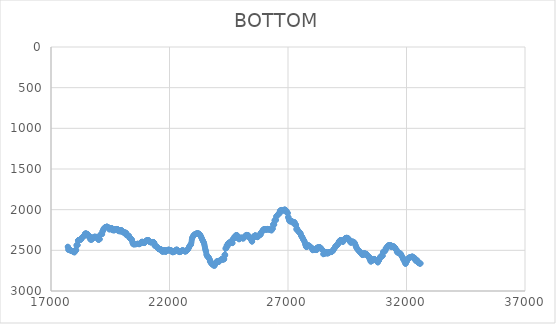
| Category | BOTTOM |
|---|---|
| 17706.1227 | 2455.2 |
| 17716.3628 | 2458.01 |
| 17726.6029 | 2493.2 |
| 17736.8429 | 2473.5 |
| 17747.083 | 2494.61 |
| 17757.323 | 2480.54 |
| 17767.5631 | 2483.35 |
| 17777.8031 | 2486.17 |
| 17788.0432 | 2490.39 |
| 17798.2833 | 2500.24 |
| 17808.5233 | 2497.43 |
| 17818.7634 | 2496.02 |
| 17829.0034 | 2500.24 |
| 17839.2435 | 2503.06 |
| 17849.4835 | 2505.87 |
| 17859.7236 | 2505.87 |
| 17869.9636 | 2507.28 |
| 17880.2037 | 2507.28 |
| 17890.4438 | 2508.69 |
| 17900.6838 | 2511.5 |
| 17910.9239 | 2508.69 |
| 17921.1639 | 2512.91 |
| 17931.404 | 2512.91 |
| 17941.644 | 2512.91 |
| 17951.8841 | 2515.73 |
| 17962.1242 | 2517.13 |
| 17972.3642 | 2519.95 |
| 17982.6043 | 2524.17 |
| 17992.8443 | 2525.58 |
| 18003.0844 | 2503.06 |
| 18013.3244 | 2501.65 |
| 18023.5645 | 2500.24 |
| 18033.8046 | 2498.84 |
| 18044.0446 | 2503.06 |
| 18054.2847 | 2498.84 |
| 18064.5247 | 2494.61 |
| 18074.7648 | 2439.72 |
| 18085.0048 | 2436.9 |
| 18095.2449 | 2434.08 |
| 18105.4849 | 2434.08 |
| 18115.725 | 2435.49 |
| 18125.9651 | 2435.49 |
| 18136.2051 | 2382 |
| 18146.4452 | 2377.78 |
| 18156.6852 | 2374.97 |
| 18166.9253 | 2373.56 |
| 18177.1653 | 2376.37 |
| 18187.4054 | 2372.15 |
| 18197.6455 | 2372.15 |
| 18207.8855 | 2370.74 |
| 18218.1256 | 2370.74 |
| 18228.3656 | 2369.33 |
| 18238.6057 | 2370.74 |
| 18248.8457 | 2366.52 |
| 18259.0858 | 2366.52 |
| 18269.3259 | 2363.7 |
| 18279.5659 | 2363.7 |
| 18289.806 | 2348.22 |
| 18300.046 | 2345.41 |
| 18310.2861 | 2341.18 |
| 18320.5261 | 2341.18 |
| 18330.7662 | 2339.77 |
| 18341.0063 | 2336.96 |
| 18351.2463 | 2332.74 |
| 18361.4864 | 2328.51 |
| 18371.7264 | 2324.29 |
| 18381.9665 | 2322.88 |
| 18392.2065 | 2318.66 |
| 18402.4466 | 2317.25 |
| 18412.6866 | 2318.66 |
| 18422.9267 | 2314.44 |
| 18433.1668 | 2296.14 |
| 18443.4068 | 2294.73 |
| 18453.6469 | 2294.73 |
| 18463.8869 | 2294.73 |
| 18474.127 | 2293.32 |
| 18484.367 | 2291.92 |
| 18494.6071 | 2296.14 |
| 18504.8472 | 2298.95 |
| 18515.0872 | 2300.36 |
| 18525.3273 | 2300.36 |
| 18535.5673 | 2298.95 |
| 18545.8074 | 2303.18 |
| 18556.0474 | 2305.99 |
| 18566.2875 | 2308.81 |
| 18576.5276 | 2311.62 |
| 18586.7676 | 2332.74 |
| 18597.0077 | 2328.51 |
| 18607.2477 | 2332.74 |
| 18617.4878 | 2331.33 |
| 18627.7278 | 2327.11 |
| 18637.9679 | 2329.92 |
| 18648.208 | 2334.14 |
| 18658.448 | 2367.93 |
| 18668.6881 | 2363.7 |
| 18678.9281 | 2365.11 |
| 18689.1682 | 2366.52 |
| 18699.4082 | 2370.74 |
| 18709.6483 | 2367.93 |
| 18719.8884 | 2363.7 |
| 18730.1284 | 2360.89 |
| 18740.3685 | 2356.67 |
| 18750.6085 | 2352.44 |
| 18760.8486 | 2355.26 |
| 18771.0886 | 2351.04 |
| 18781.3287 | 2346.81 |
| 18791.5687 | 2342.59 |
| 18801.8088 | 2338.37 |
| 18812.0489 | 2338.37 |
| 18822.2889 | 2336.96 |
| 18832.529 | 2332.74 |
| 18842.769 | 2332.74 |
| 18853.0091 | 2334.14 |
| 18863.2491 | 2334.14 |
| 18873.4892 | 2334.14 |
| 18883.7293 | 2338.37 |
| 18893.9693 | 2336.96 |
| 18904.2094 | 2338.37 |
| 18914.4494 | 2341.18 |
| 18924.6895 | 2336.96 |
| 18934.9295 | 2334.14 |
| 18945.1696 | 2334.14 |
| 18955.4097 | 2338.37 |
| 18965.6497 | 2338.37 |
| 18975.8898 | 2341.18 |
| 18986.1298 | 2365.11 |
| 18996.3699 | 2369.33 |
| 19006.6099 | 2367.93 |
| 19016.85 | 2367.93 |
| 19027.0901 | 2367.93 |
| 19037.3301 | 2363.7 |
| 19047.5702 | 2363.7 |
| 19057.8102 | 2362.3 |
| 19068.0503 | 2315.85 |
| 19078.2903 | 2311.62 |
| 19088.5304 | 2310.21 |
| 19098.7705 | 2305.99 |
| 19109.0105 | 2305.99 |
| 19119.2506 | 2297.55 |
| 19129.4906 | 2297.55 |
| 19139.7307 | 2297.55 |
| 19149.9707 | 2300.36 |
| 19160.2108 | 2300.36 |
| 19170.4508 | 2265.17 |
| 19180.6909 | 2263.76 |
| 19190.931 | 2259.54 |
| 19201.171 | 2258.13 |
| 19211.4111 | 2237.02 |
| 19221.6511 | 2237.02 |
| 19231.8912 | 2232.8 |
| 19242.1312 | 2228.57 |
| 19252.3713 | 2224.35 |
| 19262.6114 | 2222.94 |
| 19272.8514 | 2220.13 |
| 19283.0915 | 2215.9 |
| 19293.3315 | 2214.5 |
| 19303.5716 | 2215.9 |
| 19313.8116 | 2215.9 |
| 19324.0517 | 2211.68 |
| 19334.2918 | 2211.68 |
| 19344.5318 | 2211.68 |
| 19354.7719 | 2208.87 |
| 19365.0119 | 2208.87 |
| 19375.252 | 2210.27 |
| 19385.492 | 2213.09 |
| 19395.7321 | 2220.13 |
| 19405.9722 | 2217.31 |
| 19416.2122 | 2220.13 |
| 19426.4523 | 2217.31 |
| 19436.6923 | 2229.98 |
| 19446.9324 | 2222.94 |
| 19457.1724 | 2244.06 |
| 19467.4125 | 2229.98 |
| 19477.6526 | 2229.98 |
| 19487.8926 | 2234.2 |
| 19498.1327 | 2237.02 |
| 19508.3727 | 2234.2 |
| 19518.6128 | 2234.2 |
| 19528.8528 | 2227.17 |
| 19539.0929 | 2225.76 |
| 19549.3329 | 2225.76 |
| 19559.573 | 2225.76 |
| 19569.8131 | 2231.39 |
| 19580.0531 | 2251.09 |
| 19590.2932 | 2249.69 |
| 19600.5332 | 2249.69 |
| 19610.7733 | 2237.02 |
| 19621.0133 | 2237.02 |
| 19631.2534 | 2238.43 |
| 19641.4935 | 2256.73 |
| 19651.7335 | 2239.83 |
| 19661.9736 | 2241.24 |
| 19672.2136 | 2244.06 |
| 19682.4537 | 2252.5 |
| 19692.6937 | 2246.87 |
| 19702.9338 | 2242.65 |
| 19713.1739 | 2241.24 |
| 19723.4139 | 2239.83 |
| 19733.654 | 2239.83 |
| 19743.894 | 2238.43 |
| 19754.1341 | 2238.43 |
| 19764.3741 | 2238.43 |
| 19774.6142 | 2237.02 |
| 19784.8543 | 2238.43 |
| 19795.0943 | 2239.83 |
| 19805.3344 | 2242.65 |
| 19815.5744 | 2241.24 |
| 19825.8145 | 2248.28 |
| 19836.0545 | 2260.95 |
| 19846.2946 | 2251.09 |
| 19856.5347 | 2259.54 |
| 19866.7747 | 2259.54 |
| 19877.0148 | 2266.58 |
| 19887.2548 | 2255.32 |
| 19897.4949 | 2265.17 |
| 19907.7349 | 2252.5 |
| 19917.975 | 2256.73 |
| 19928.2151 | 2260.95 |
| 19938.4551 | 2262.36 |
| 19948.6952 | 2251.09 |
| 19958.9352 | 2251.09 |
| 19969.1753 | 2272.21 |
| 19979.4153 | 2253.91 |
| 19989.6554 | 2259.54 |
| 19999.8954 | 2260.95 |
| 20010.1355 | 2260.95 |
| 20020.3756 | 2265.17 |
| 20030.6156 | 2269.39 |
| 20040.8557 | 2273.62 |
| 20051.0957 | 2275.02 |
| 20061.3358 | 2277.84 |
| 20071.5758 | 2282.06 |
| 20081.8159 | 2287.69 |
| 20092.056 | 2283.47 |
| 20102.296 | 2283.47 |
| 20112.5361 | 2280.65 |
| 20122.7761 | 2282.06 |
| 20133.0162 | 2282.06 |
| 20143.2562 | 2283.47 |
| 20153.4963 | 2283.47 |
| 20163.7364 | 2284.88 |
| 20173.9764 | 2287.69 |
| 20184.2165 | 2314.44 |
| 20194.4565 | 2311.62 |
| 20204.6966 | 2311.62 |
| 20214.9366 | 2311.62 |
| 20225.1767 | 2314.44 |
| 20235.4168 | 2315.85 |
| 20245.6568 | 2313.03 |
| 20255.8969 | 2318.66 |
| 20266.1369 | 2320.07 |
| 20276.377 | 2321.48 |
| 20286.617 | 2321.48 |
| 20296.8571 | 2325.7 |
| 20307.0972 | 2345.41 |
| 20317.3372 | 2345.41 |
| 20327.5773 | 2346.81 |
| 20337.8173 | 2351.04 |
| 20348.0574 | 2351.04 |
| 20358.2974 | 2353.85 |
| 20368.5375 | 2358.07 |
| 20378.7776 | 2358.07 |
| 20389.0176 | 2362.3 |
| 20399.2577 | 2366.52 |
| 20409.4977 | 2370.74 |
| 20419.7378 | 2373.56 |
| 20429.9778 | 2391.57 |
| 20440.2179 | 2405.01 |
| 20450.458 | 2414.51 |
| 20460.698 | 2420.71 |
| 20470.9381 | 2424.23 |
| 20481.1781 | 2425.71 |
| 20491.4182 | 2425.79 |
| 20501.6582 | 2425.08 |
| 20511.8983 | 2424.23 |
| 20522.1383 | 2423.74 |
| 20532.3784 | 2423.62 |
| 20542.6185 | 2423.74 |
| 20552.8585 | 2423.99 |
| 20563.0986 | 2424.23 |
| 20573.3386 | 2424.35 |
| 20583.5787 | 2424.23 |
| 20593.8187 | 2423.79 |
| 20604.0588 | 2423.09 |
| 20614.2989 | 2422.25 |
| 20624.5389 | 2421.4 |
| 20634.779 | 2420.63 |
| 20645.019 | 2420.07 |
| 20655.2591 | 2419.82 |
| 20665.4991 | 2420.01 |
| 20675.7392 | 2420.68 |
| 20685.9793 | 2421.67 |
| 20696.2193 | 2422.72 |
| 20706.4594 | 2423.6 |
| 20716.6994 | 2424.07 |
| 20726.9395 | 2423.89 |
| 20737.1795 | 2422.82 |
| 20747.4196 | 2420.72 |
| 20757.6597 | 2417.77 |
| 20767.8997 | 2414.26 |
| 20778.1398 | 2410.46 |
| 20788.3798 | 2406.65 |
| 20798.6199 | 2403.12 |
| 20808.8599 | 2400.1 |
| 20819.1 | 2397.71 |
| 20829.3401 | 2396.02 |
| 20839.5801 | 2395.08 |
| 20849.8202 | 2394.96 |
| 20860.0602 | 2395.74 |
| 20870.3003 | 2397.49 |
| 20880.5403 | 2400.16 |
| 20890.7804 | 2403.33 |
| 20901.0205 | 2406.45 |
| 20911.2605 | 2408.99 |
| 20921.5006 | 2410.4 |
| 20931.7406 | 2410.16 |
| 20941.9807 | 2407.94 |
| 20952.2207 | 2404.37 |
| 20962.4608 | 2400.3 |
| 20972.7009 | 2396.43 |
| 20982.9409 | 2392.87 |
| 20993.181 | 2389.62 |
| 21003.421 | 2386.64 |
| 21013.6611 | 2383.93 |
| 21023.9011 | 2381.45 |
| 21034.1412 | 2379.19 |
| 21044.3813 | 2377.14 |
| 21054.6213 | 2375.41 |
| 21064.8614 | 2374.1 |
| 21075.1014 | 2373.32 |
| 21085.3415 | 2373.18 |
| 21095.5815 | 2373.81 |
| 21105.8216 | 2375.3 |
| 21116.0617 | 2377.78 |
| 21126.3017 | 2381.25 |
| 21136.5418 | 2385.32 |
| 21146.7818 | 2389.49 |
| 21157.0219 | 2393.26 |
| 21167.2619 | 2396.24 |
| 21177.502 | 2398.41 |
| 21187.742 | 2399.88 |
| 21197.9821 | 2400.75 |
| 21208.2222 | 2401.11 |
| 21218.4622 | 2401.05 |
| 21228.7023 | 2400.68 |
| 21238.9423 | 2400.1 |
| 21249.1824 | 2399.4 |
| 21259.4224 | 2398.67 |
| 21269.6625 | 2398.02 |
| 21279.9026 | 2397.54 |
| 21290.1426 | 2397.33 |
| 21300.3827 | 2397.49 |
| 21310.6227 | 2398.11 |
| 21320.8628 | 2399.29 |
| 21331.1028 | 2401.13 |
| 21341.3429 | 2403.72 |
| 21351.583 | 2407.17 |
| 21361.823 | 2411.56 |
| 21372.0631 | 2442.53 |
| 21382.3031 | 2442.53 |
| 21392.5432 | 2442.53 |
| 21402.7832 | 2442.53 |
| 21413.0233 | 2448.16 |
| 21423.2634 | 2446.75 |
| 21433.5034 | 2449.57 |
| 21443.7435 | 2449.57 |
| 21453.9835 | 2453.79 |
| 21464.2236 | 2456.61 |
| 21474.4636 | 2459.42 |
| 21484.7037 | 2462.24 |
| 21494.9438 | 2463.64 |
| 21505.1838 | 2473.5 |
| 21515.4239 | 2477.72 |
| 21525.6639 | 2479.13 |
| 21535.904 | 2479.13 |
| 21546.144 | 2483.35 |
| 21556.3841 | 2484.76 |
| 21566.6242 | 2486.17 |
| 21576.8642 | 2488.98 |
| 21587.1043 | 2486.17 |
| 21597.3443 | 2486.17 |
| 21607.5844 | 2484.76 |
| 21617.8244 | 2484.76 |
| 21628.0645 | 2486.17 |
| 21638.3046 | 2490.39 |
| 21648.5446 | 2490.39 |
| 21658.7847 | 2491.8 |
| 21669.0247 | 2498.84 |
| 21679.2648 | 2512.91 |
| 21689.5048 | 2514.32 |
| 21699.7449 | 2514.32 |
| 21709.985 | 2511.5 |
| 21720.225 | 2512.91 |
| 21730.4651 | 2514.32 |
| 21740.7051 | 2514.32 |
| 21750.9452 | 2500.24 |
| 21761.1852 | 2500.24 |
| 21771.4253 | 2498.84 |
| 21781.6654 | 2497.43 |
| 21791.9054 | 2497.43 |
| 21802.1455 | 2498.84 |
| 21812.3855 | 2500.24 |
| 21822.6256 | 2518.54 |
| 21832.8656 | 2515.73 |
| 21843.1057 | 2512.91 |
| 21853.3458 | 2512.91 |
| 21863.5858 | 2511.5 |
| 21873.8259 | 2510.1 |
| 21884.0659 | 2508.69 |
| 21894.306 | 2507.28 |
| 21904.546 | 2505.87 |
| 21914.7861 | 2497.43 |
| 21925.0262 | 2494.61 |
| 21935.2662 | 2494.61 |
| 21945.5063 | 2494.61 |
| 21955.7463 | 2493.2 |
| 21965.9864 | 2491.8 |
| 21976.2264 | 2491.8 |
| 21986.4665 | 2498.84 |
| 21996.7066 | 2498.84 |
| 22006.9466 | 2501.65 |
| 22017.1867 | 2498.84 |
| 22027.4267 | 2498.84 |
| 22037.6668 | 2500.24 |
| 22047.9068 | 2501.65 |
| 22058.1469 | 2501.65 |
| 22068.387 | 2501.65 |
| 22078.627 | 2503.06 |
| 22088.8671 | 2505.87 |
| 22099.1071 | 2505.87 |
| 22109.3472 | 2521.36 |
| 22119.5872 | 2521.36 |
| 22129.8273 | 2521.36 |
| 22140.0674 | 2524.17 |
| 22150.3074 | 2521.36 |
| 22160.5475 | 2521.36 |
| 22170.7875 | 2518.54 |
| 22181.0276 | 2515.73 |
| 22191.2676 | 2515.73 |
| 22201.5077 | 2519.95 |
| 22211.7478 | 2505.87 |
| 22221.9878 | 2505.87 |
| 22232.2279 | 2507.28 |
| 22242.4679 | 2505.87 |
| 22252.708 | 2505.87 |
| 22262.948 | 2499.89 |
| 22273.1881 | 2495.67 |
| 22283.4281 | 2493.03 |
| 22293.6682 | 2491.79 |
| 22303.9083 | 2491.78 |
| 22314.1483 | 2492.81 |
| 22324.3884 | 2494.7 |
| 22334.6284 | 2497.27 |
| 22344.8685 | 2500.35 |
| 22355.1085 | 2503.74 |
| 22365.3486 | 2507.28 |
| 22375.5887 | 2510.78 |
| 22385.8287 | 2514.05 |
| 22396.0688 | 2516.93 |
| 22406.3088 | 2519.23 |
| 22416.5489 | 2520.76 |
| 22426.7889 | 2521.36 |
| 22437.029 | 2520.9 |
| 22447.2691 | 2519.54 |
| 22457.5091 | 2517.52 |
| 22467.7492 | 2515.06 |
| 22477.9892 | 2512.38 |
| 22488.2293 | 2509.71 |
| 22498.4693 | 2507.28 |
| 22508.7094 | 2505.28 |
| 22518.9495 | 2503.72 |
| 22529.1895 | 2502.6 |
| 22539.4296 | 2501.9 |
| 22549.6696 | 2501.61 |
| 22559.9097 | 2501.72 |
| 22570.1497 | 2502.21 |
| 22580.3898 | 2503.06 |
| 22590.6299 | 2504.25 |
| 22600.8699 | 2505.67 |
| 22611.11 | 2507.22 |
| 22621.35 | 2508.79 |
| 22631.5901 | 2510.25 |
| 22641.8301 | 2511.5 |
| 22652.0702 | 2512.43 |
| 22662.3103 | 2512.91 |
| 22672.5503 | 2512.86 |
| 22682.7904 | 2512.29 |
| 22693.0304 | 2511.21 |
| 22703.2705 | 2509.66 |
| 22713.5105 | 2507.66 |
| 22723.7506 | 2505.22 |
| 22733.9907 | 2502.39 |
| 22744.2307 | 2499.19 |
| 22754.4708 | 2495.63 |
| 22764.7108 | 2491.75 |
| 22774.9509 | 2487.57 |
| 22785.1909 | 2483.09 |
| 22795.431 | 2478.18 |
| 22805.6711 | 2472.69 |
| 22815.9111 | 2466.46 |
| 22826.1512 | 2459.48 |
| 22836.3912 | 2452.32 |
| 22846.6313 | 2445.7 |
| 22856.8713 | 2440.32 |
| 22867.1114 | 2436.9 |
| 22877.3515 | 2435.68 |
| 22887.5915 | 2434.98 |
| 22897.8316 | 2432.63 |
| 22908.0716 | 2426.48 |
| 22918.3117 | 2414.38 |
| 22928.5517 | 2395.44 |
| 22938.7918 | 2373.89 |
| 22949.0319 | 2355.26 |
| 22959.2719 | 2347.4 |
| 22969.512 | 2340.38 |
| 22979.752 | 2334.14 |
| 22989.9921 | 2328.63 |
| 23000.2321 | 2323.77 |
| 23010.4722 | 2319.52 |
| 23020.7123 | 2315.8 |
| 23030.9523 | 2312.56 |
| 23041.1924 | 2309.74 |
| 23051.4324 | 2307.28 |
| 23061.6725 | 2305.11 |
| 23071.9125 | 2303.18 |
| 23082.1526 | 2301.43 |
| 23092.3927 | 2299.84 |
| 23102.6327 | 2298.41 |
| 23112.8728 | 2297.13 |
| 23123.1128 | 2295.99 |
| 23133.3529 | 2294.98 |
| 23143.5929 | 2294.1 |
| 23153.833 | 2293.32 |
| 23164.0731 | 2292.67 |
| 23174.3131 | 2292.17 |
| 23184.5532 | 2291.9 |
| 23194.7932 | 2291.92 |
| 23205.0333 | 2292.26 |
| 23215.2733 | 2292.97 |
| 23225.5134 | 2294.07 |
| 23235.7535 | 2295.58 |
| 23245.9935 | 2297.54 |
| 23256.2336 | 2299.95 |
| 23266.4736 | 2302.85 |
| 23276.7137 | 2306.26 |
| 23286.9537 | 2310.21 |
| 23297.1938 | 2314.72 |
| 23307.4339 | 2319.76 |
| 23317.6739 | 2325.3 |
| 23327.914 | 2331.33 |
| 23338.154 | 2337.79 |
| 23348.3941 | 2344.55 |
| 23358.6341 | 2351.47 |
| 23368.8742 | 2358.37 |
| 23379.1143 | 2365.11 |
| 23389.3543 | 2371.56 |
| 23399.5944 | 2377.7 |
| 23409.8344 | 2383.53 |
| 23420.0745 | 2389.04 |
| 23430.3145 | 2394.39 |
| 23440.5546 | 2400.29 |
| 23450.7947 | 2407.6 |
| 23461.0347 | 2417.19 |
| 23471.2748 | 2429.6 |
| 23481.5148 | 2444.05 |
| 23491.7549 | 2459.42 |
| 23501.9949 | 2474.62 |
| 23512.235 | 2488.53 |
| 23522.4751 | 2500.06 |
| 23532.7151 | 2508.08 |
| 23542.9552 | 2511.5 |
| 23553.1952 | 2539.66 |
| 23563.4353 | 2557.96 |
| 23573.6753 | 2560.77 |
| 23583.9154 | 2562.18 |
| 23594.1555 | 2574.85 |
| 23604.3955 | 2574.85 |
| 23614.6356 | 2576.25 |
| 23624.8756 | 2579.07 |
| 23635.1157 | 2580.48 |
| 23645.3557 | 2586.11 |
| 23655.5958 | 2587.52 |
| 23665.8359 | 2597.37 |
| 23676.0759 | 2600.18 |
| 23686.316 | 2607.22 |
| 23696.556 | 2612.85 |
| 23706.7961 | 2636.78 |
| 23717.0361 | 2631.15 |
| 23727.2762 | 2631.15 |
| 23737.5163 | 2650.86 |
| 23747.7563 | 2650.86 |
| 23757.9964 | 2655.08 |
| 23768.2364 | 2659.3 |
| 23778.4765 | 2664.93 |
| 23788.7165 | 2666.34 |
| 23798.9566 | 2667.75 |
| 23809.1967 | 2669.16 |
| 23819.4367 | 2670.56 |
| 23829.6768 | 2673.38 |
| 23839.9168 | 2681.83 |
| 23850.1569 | 2686.05 |
| 23860.397 | 2683.23 |
| 23870.637 | 2679.01 |
| 23880.8771 | 2683.23 |
| 23891.1171 | 2687.46 |
| 23901.3572 | 2690.27 |
| 23911.5972 | 2671.97 |
| 23921.8373 | 2667.75 |
| 23932.0774 | 2666.34 |
| 23942.3174 | 2663.53 |
| 23952.5575 | 2659.3 |
| 23962.7975 | 2655.08 |
| 23973.0376 | 2656.49 |
| 23983.2776 | 2639.6 |
| 23993.5177 | 2638.19 |
| 24003.7578 | 2633.97 |
| 24013.9978 | 2638.19 |
| 24024.2379 | 2636.78 |
| 24034.4779 | 2635.37 |
| 24044.718 | 2636.78 |
| 24054.958 | 2635.37 |
| 24065.1981 | 2639.6 |
| 24075.4382 | 2639.6 |
| 24085.6782 | 2642.41 |
| 24095.9183 | 2631.15 |
| 24106.1583 | 2632.56 |
| 24116.3984 | 2628.34 |
| 24126.6384 | 2624.11 |
| 24136.8785 | 2622.71 |
| 24147.1186 | 2618.48 |
| 24157.3586 | 2617.08 |
| 24167.5987 | 2618.48 |
| 24177.8387 | 2614.26 |
| 24188.0788 | 2610.04 |
| 24198.3188 | 2610.04 |
| 24208.5589 | 2610.04 |
| 24218.799 | 2605.81 |
| 24229.039 | 2610.04 |
| 24239.2791 | 2608.63 |
| 24249.5191 | 2611.44 |
| 24259.7592 | 2615.67 |
| 24269.9992 | 2608.63 |
| 24280.2393 | 2608.63 |
| 24290.4794 | 2610.04 |
| 24300.7194 | 2610.04 |
| 24310.9595 | 2605.81 |
| 24321.1995 | 2556.55 |
| 24331.4396 | 2553.73 |
| 24341.6796 | 2557.96 |
| 24351.9197 | 2557.96 |
| 24362.1598 | 2479.13 |
| 24372.3998 | 2474.91 |
| 24382.6399 | 2470.68 |
| 24392.8799 | 2472.09 |
| 24403.12 | 2467.87 |
| 24413.36 | 2439.72 |
| 24423.6001 | 2439.72 |
| 24433.8402 | 2439.72 |
| 24444.0802 | 2443.94 |
| 24454.3203 | 2448.16 |
| 24464.5603 | 2417.19 |
| 24474.8004 | 2415.79 |
| 24485.0404 | 2411.56 |
| 24495.2805 | 2412.97 |
| 24505.5206 | 2412.97 |
| 24515.7606 | 2408.75 |
| 24526.0007 | 2405.93 |
| 24536.2407 | 2405.93 |
| 24546.4808 | 2401.71 |
| 24556.7208 | 2398.89 |
| 24566.9609 | 2394.67 |
| 24577.201 | 2393.26 |
| 24587.441 | 2397.49 |
| 24597.6811 | 2397.49 |
| 24607.9211 | 2400.3 |
| 24618.1612 | 2404.53 |
| 24628.4012 | 2404.53 |
| 24638.6413 | 2408.75 |
| 24648.8814 | 2408.75 |
| 24659.1214 | 2411.56 |
| 24669.3615 | 2365.11 |
| 24679.6015 | 2360.89 |
| 24689.8416 | 2358.07 |
| 24700.0816 | 2360.89 |
| 24710.3217 | 2356.67 |
| 24720.5618 | 2353.85 |
| 24730.8018 | 2353.85 |
| 24741.0419 | 2332.74 |
| 24751.2819 | 2329.92 |
| 24761.522 | 2334.14 |
| 24771.762 | 2331.33 |
| 24782.0021 | 2334.14 |
| 24792.2422 | 2334.14 |
| 24802.4822 | 2314.44 |
| 24812.7223 | 2314.44 |
| 24822.9623 | 2313.03 |
| 24833.2024 | 2314.44 |
| 24843.4424 | 2315.85 |
| 24853.6825 | 2317.25 |
| 24863.9226 | 2318.66 |
| 24874.1626 | 2348.22 |
| 24884.4027 | 2348.22 |
| 24894.6427 | 2349.63 |
| 24904.8828 | 2348.22 |
| 24915.1228 | 2352.44 |
| 24925.3629 | 2355.26 |
| 24935.603 | 2365.11 |
| 24945.843 | 2360.89 |
| 24956.0831 | 2356.67 |
| 24966.3231 | 2355.26 |
| 24976.5632 | 2351.04 |
| 24986.8033 | 2348.22 |
| 24997.0433 | 2346.81 |
| 25007.2834 | 2345.41 |
| 25017.5234 | 2345.41 |
| 25027.7635 | 2345.41 |
| 25038.0035 | 2345.41 |
| 25048.2436 | 2345.41 |
| 25058.4837 | 2349.63 |
| 25068.7237 | 2351.04 |
| 25078.9638 | 2351.04 |
| 25089.2038 | 2352.44 |
| 25099.4439 | 2351.04 |
| 25109.6839 | 2351.04 |
| 25119.924 | 2355.26 |
| 25130.1641 | 2341.18 |
| 25140.4041 | 2341.18 |
| 25150.6442 | 2339.77 |
| 25160.8842 | 2336.96 |
| 25171.1243 | 2332.74 |
| 25181.3643 | 2332.74 |
| 25191.6044 | 2331.33 |
| 25201.8445 | 2318.66 |
| 25212.0845 | 2320.07 |
| 25222.3246 | 2317.25 |
| 25232.5646 | 2315.85 |
| 25242.8047 | 2313.03 |
| 25253.0447 | 2310.21 |
| 25263.2848 | 2315.85 |
| 25273.5249 | 2311.62 |
| 25283.7649 | 2311.62 |
| 25294.005 | 2315.85 |
| 25304.245 | 2313.03 |
| 25314.4851 | 2315.85 |
| 25324.7251 | 2317.25 |
| 25334.9652 | 2329.92 |
| 25345.2053 | 2334.14 |
| 25355.4453 | 2334.14 |
| 25365.6854 | 2336.96 |
| 25375.9254 | 2338.37 |
| 25386.1655 | 2342.59 |
| 25396.4055 | 2342.59 |
| 25406.6456 | 2346.81 |
| 25416.8857 | 2359.48 |
| 25427.1257 | 2362.3 |
| 25437.3658 | 2362.3 |
| 25447.6058 | 2366.52 |
| 25457.8459 | 2369.33 |
| 25468.0859 | 2389.04 |
| 25478.326 | 2391.86 |
| 25488.5661 | 2391.86 |
| 25498.8061 | 2352.44 |
| 25509.0462 | 2351.04 |
| 25519.2862 | 2346.81 |
| 25529.5263 | 2345.41 |
| 25539.7663 | 2349.63 |
| 25550.0064 | 2331.33 |
| 25560.2465 | 2327.11 |
| 25570.4865 | 2325.7 |
| 25580.7266 | 2324.29 |
| 25590.9666 | 2320.07 |
| 25601.2067 | 2320.07 |
| 25611.4467 | 2317.25 |
| 25621.6868 | 2317.25 |
| 25631.9269 | 2317.25 |
| 25642.1669 | 2321.48 |
| 25652.407 | 2324.29 |
| 25662.647 | 2332.74 |
| 25672.8871 | 2331.33 |
| 25683.1272 | 2327.11 |
| 25693.3672 | 2329.92 |
| 25703.6073 | 2334.14 |
| 25713.8473 | 2338.37 |
| 25724.0874 | 2336.96 |
| 25734.3274 | 2329.92 |
| 25744.5675 | 2325.7 |
| 25754.8076 | 2321.48 |
| 25765.0476 | 2317.25 |
| 25775.2877 | 2317.25 |
| 25785.5277 | 2313.03 |
| 25795.7678 | 2307.4 |
| 25806.0078 | 2307.4 |
| 25816.2479 | 2305.99 |
| 25826.488 | 2305.99 |
| 25836.728 | 2307.4 |
| 25846.9681 | 2308.81 |
| 25857.2081 | 2284.88 |
| 25867.4482 | 2280.65 |
| 25877.6882 | 2276.43 |
| 25887.9283 | 2275.02 |
| 25898.1684 | 2272.21 |
| 25908.4084 | 2267.99 |
| 25918.6485 | 2267.99 |
| 25928.8885 | 2256.73 |
| 25939.1286 | 2252.5 |
| 25949.3686 | 2249.69 |
| 25959.6087 | 2246.87 |
| 25969.8488 | 2244.06 |
| 25980.0888 | 2244.06 |
| 25990.3289 | 2239.83 |
| 26000.5689 | 2238.43 |
| 26010.809 | 2242.65 |
| 26021.049 | 2241.24 |
| 26031.2891 | 2237.02 |
| 26041.5292 | 2238.43 |
| 26051.7692 | 2238.43 |
| 26062.0093 | 2238.43 |
| 26072.2493 | 2242.65 |
| 26082.4894 | 2246.87 |
| 26092.7294 | 2248.28 |
| 26102.9695 | 2239.83 |
| 26113.2096 | 2242.65 |
| 26123.4496 | 2238.43 |
| 26133.6897 | 2237.02 |
| 26143.9297 | 2237.02 |
| 26154.1698 | 2238.43 |
| 26164.4099 | 2238.43 |
| 26174.6499 | 2241.24 |
| 26184.89 | 2241.24 |
| 26195.13 | 2241.24 |
| 26205.3701 | 2242.65 |
| 26215.6101 | 2244.06 |
| 26225.8502 | 2242.65 |
| 26236.0903 | 2246.87 |
| 26246.3303 | 2248.28 |
| 26256.5704 | 2246.87 |
| 26266.8104 | 2245.46 |
| 26277.0505 | 2248.28 |
| 26287.2905 | 2249.69 |
| 26297.5306 | 2253.91 |
| 26307.7707 | 2255.32 |
| 26318.0107 | 2244.06 |
| 26328.2508 | 2239.83 |
| 26338.4908 | 2237.02 |
| 26348.7309 | 2235.61 |
| 26358.9709 | 2231.39 |
| 26369.211 | 2184.94 |
| 26379.4511 | 2180.71 |
| 26389.6911 | 2180.71 |
| 26399.9312 | 2180.71 |
| 26410.1712 | 2182.12 |
| 26420.4113 | 2183.53 |
| 26430.6513 | 2134.26 |
| 26440.8914 | 2131.45 |
| 26451.1315 | 2127.22 |
| 26461.3715 | 2127.22 |
| 26471.6116 | 2127.22 |
| 26481.8516 | 2127.22 |
| 26492.0917 | 2128.63 |
| 26502.3317 | 2086.4 |
| 26512.5718 | 2082.18 |
| 26522.8119 | 2079.37 |
| 26533.0519 | 2075.14 |
| 26543.292 | 2070.92 |
| 26553.532 | 2069.51 |
| 26563.7721 | 2065.29 |
| 26574.0121 | 2061.07 |
| 26584.2522 | 2058.25 |
| 26594.4923 | 2054.03 |
| 26604.7323 | 2049.81 |
| 26614.9724 | 2046.99 |
| 26625.2124 | 2042.77 |
| 26635.4525 | 2044.18 |
| 26645.6926 | 2048.4 |
| 26655.9326 | 2017.43 |
| 26666.1727 | 2014.62 |
| 26676.4127 | 2013.21 |
| 26686.6528 | 2008.98 |
| 26696.8928 | 2008.98 |
| 26707.1329 | 2006.17 |
| 26717.373 | 2006.17 |
| 26727.613 | 2004.76 |
| 26737.8531 | 2003.35 |
| 26748.0931 | 2003.35 |
| 26758.3332 | 2006.17 |
| 26768.5732 | 2007.58 |
| 26778.8133 | 2010.39 |
| 26789.0534 | 2011.8 |
| 26799.2934 | 2007.58 |
| 26809.5335 | 2007.58 |
| 26819.7735 | 2004.76 |
| 26830.0136 | 2003.35 |
| 26840.2536 | 2000.54 |
| 26850.4937 | 2001.95 |
| 26860.7338 | 1999.13 |
| 26870.9738 | 2000.54 |
| 26881.2139 | 2001.95 |
| 26891.4539 | 2003.35 |
| 26901.694 | 2006.17 |
| 26911.934 | 2010.39 |
| 26922.1741 | 2011.8 |
| 26932.4142 | 2016.02 |
| 26942.6542 | 2018.84 |
| 26952.8943 | 2037.14 |
| 26963.1343 | 2037.14 |
| 26973.3744 | 2035.73 |
| 26983.6144 | 2039.95 |
| 26993.8545 | 2044.18 |
| 27004.0946 | 2092.03 |
| 27014.3346 | 2093.44 |
| 27024.5747 | 2096.26 |
| 27034.8147 | 2118.78 |
| 27045.0548 | 2120.19 |
| 27055.2949 | 2138.49 |
| 27065.5349 | 2139.89 |
| 27075.775 | 2139.89 |
| 27086.015 | 2141.3 |
| 27096.2551 | 2141.3 |
| 27106.4951 | 2146.93 |
| 27116.7352 | 2145.52 |
| 27126.9753 | 2141.3 |
| 27137.2153 | 2138.49 |
| 27147.4554 | 2138.49 |
| 27157.6954 | 2141.3 |
| 27167.9355 | 2145.52 |
| 27178.1755 | 2145.52 |
| 27188.4156 | 2148.34 |
| 27198.6557 | 2159.6 |
| 27208.8957 | 2158.19 |
| 27219.1358 | 2159.6 |
| 27229.3758 | 2156.78 |
| 27239.6159 | 2156.78 |
| 27249.8559 | 2156.78 |
| 27260.096 | 2155.38 |
| 27270.3361 | 2152.56 |
| 27280.5761 | 2156.78 |
| 27290.8162 | 2184.94 |
| 27301.0562 | 2183.53 |
| 27311.2963 | 2187.75 |
| 27321.5363 | 2184.94 |
| 27331.7764 | 2184.94 |
| 27342.0165 | 2189.16 |
| 27352.2565 | 2242.65 |
| 27362.4966 | 2238.43 |
| 27372.7366 | 2234.2 |
| 27382.9767 | 2231.39 |
| 27393.2168 | 2253.91 |
| 27403.4568 | 2252.5 |
| 27413.6969 | 2253.91 |
| 27423.9369 | 2253.91 |
| 27434.177 | 2256.73 |
| 27444.417 | 2270.8 |
| 27454.6571 | 2272.21 |
| 27464.8972 | 2273.62 |
| 27475.1372 | 2276.43 |
| 27485.3773 | 2279.25 |
| 27495.6173 | 2280.65 |
| 27505.8574 | 2287.69 |
| 27516.0974 | 2289.1 |
| 27526.3375 | 2289.1 |
| 27536.5776 | 2298.95 |
| 27546.8176 | 2314.44 |
| 27557.0577 | 2317.25 |
| 27567.2977 | 2327.11 |
| 27577.5378 | 2327.11 |
| 27587.7778 | 2334.14 |
| 27598.0179 | 2337.08 |
| 27608.258 | 2342.61 |
| 27618.498 | 2349.63 |
| 27628.7381 | 2357.03 |
| 27638.9781 | 2363.7 |
| 27649.2182 | 2368.88 |
| 27659.4582 | 2373.04 |
| 27669.6983 | 2377.01 |
| 27679.9384 | 2381.61 |
| 27690.1784 | 2387.63 |
| 27700.4185 | 2395.67 |
| 27710.6585 | 2405.27 |
| 27720.8986 | 2415.79 |
| 27731.1387 | 2426.53 |
| 27741.3787 | 2436.82 |
| 27751.6188 | 2445.99 |
| 27761.8588 | 2453.37 |
| 27772.0989 | 2458.28 |
| 27782.3389 | 2460.04 |
| 27792.579 | 2457.98 |
| 27802.8191 | 2451.43 |
| 27813.0591 | 2439.72 |
| 27823.2992 | 2439.72 |
| 27833.5392 | 2441.12 |
| 27843.7793 | 2442.53 |
| 27854.0193 | 2445.35 |
| 27864.2594 | 2439.72 |
| 27874.4995 | 2439.72 |
| 27884.7395 | 2442.53 |
| 27894.9796 | 2442.53 |
| 27905.2196 | 2448.16 |
| 27915.4597 | 2448.16 |
| 27925.6997 | 2452.38 |
| 27935.9398 | 2453.79 |
| 27946.1799 | 2455.2 |
| 27956.4199 | 2458.01 |
| 27966.66 | 2465.05 |
| 27976.9 | 2467.87 |
| 27987.1401 | 2472.09 |
| 27997.3802 | 2474.91 |
| 28007.6202 | 2470.68 |
| 28017.8603 | 2476.31 |
| 28028.1003 | 2479.13 |
| 28038.3404 | 2498.84 |
| 28048.5804 | 2494.61 |
| 28058.8205 | 2493.2 |
| 28069.0606 | 2490.39 |
| 28079.3006 | 2490.39 |
| 28089.5407 | 2488.98 |
| 28099.7807 | 2487.57 |
| 28110.0208 | 2488.98 |
| 28120.2608 | 2488.98 |
| 28130.5009 | 2490.39 |
| 28140.741 | 2490.39 |
| 28150.981 | 2491.8 |
| 28161.2211 | 2494.61 |
| 28171.4611 | 2494.61 |
| 28181.7012 | 2497.43 |
| 28191.9412 | 2474.91 |
| 28202.1813 | 2494.61 |
| 28212.4214 | 2496.02 |
| 28222.6614 | 2467.87 |
| 28232.9015 | 2467.87 |
| 28243.1415 | 2470.68 |
| 28253.3816 | 2466.46 |
| 28263.6216 | 2465.05 |
| 28273.8617 | 2465.05 |
| 28284.1018 | 2467.87 |
| 28294.3418 | 2463.64 |
| 28304.5819 | 2462.24 |
| 28314.8219 | 2462.24 |
| 28325.062 | 2463.64 |
| 28335.3021 | 2463.64 |
| 28345.5421 | 2463.64 |
| 28355.7822 | 2466.46 |
| 28366.0222 | 2466.46 |
| 28376.2623 | 2469.28 |
| 28386.5023 | 2479.13 |
| 28396.7424 | 2476.31 |
| 28406.9825 | 2480.54 |
| 28417.2225 | 2483.35 |
| 28427.4626 | 2488.98 |
| 28437.7026 | 2491.8 |
| 28447.9427 | 2493.2 |
| 28458.1827 | 2498.84 |
| 28468.4228 | 2501.65 |
| 28478.6629 | 2501.65 |
| 28488.9029 | 2548.1 |
| 28499.143 | 2542.47 |
| 28509.383 | 2542.47 |
| 28519.6231 | 2542.47 |
| 28529.8631 | 2536.84 |
| 28540.1032 | 2534.03 |
| 28550.3433 | 2542.47 |
| 28560.5833 | 2528.4 |
| 28570.8234 | 2526.99 |
| 28581.0634 | 2528.4 |
| 28591.3035 | 2522.76 |
| 28601.5436 | 2521.36 |
| 28611.7836 | 2521.36 |
| 28622.0237 | 2531.21 |
| 28632.2637 | 2538.25 |
| 28642.5038 | 2522.76 |
| 28652.7438 | 2535.43 |
| 28662.9839 | 2534.03 |
| 28673.224 | 2531.21 |
| 28683.464 | 2539.66 |
| 28693.7041 | 2529.8 |
| 28703.9441 | 2532.62 |
| 28714.1842 | 2531.21 |
| 28724.4242 | 2526.99 |
| 28734.6643 | 2524.17 |
| 28744.9044 | 2524.17 |
| 28755.1444 | 2522.76 |
| 28765.3845 | 2521.36 |
| 28775.6245 | 2521.36 |
| 28785.8646 | 2519.95 |
| 28796.1046 | 2518.54 |
| 28806.3447 | 2522.76 |
| 28816.5848 | 2517.13 |
| 28826.8248 | 2518.54 |
| 28837.0649 | 2519.95 |
| 28847.3049 | 2514.32 |
| 28857.545 | 2514.32 |
| 28867.7851 | 2511.5 |
| 28878.0251 | 2510.1 |
| 28888.2652 | 2510.1 |
| 28898.5052 | 2503.5 |
| 28908.7453 | 2497.43 |
| 28918.9853 | 2491.89 |
| 28929.2254 | 2486.87 |
| 28939.4655 | 2482.38 |
| 28949.7055 | 2478.42 |
| 28959.9456 | 2474.99 |
| 28970.1856 | 2472.09 |
| 28980.4257 | 2464.78 |
| 28990.6657 | 2457.82 |
| 29000.9058 | 2451.66 |
| 29011.1459 | 2446.75 |
| 29021.3859 | 2443.42 |
| 29031.626 | 2441.37 |
| 29041.866 | 2440.15 |
| 29052.1061 | 2439.34 |
| 29062.3461 | 2438.48 |
| 29072.5862 | 2437.15 |
| 29082.8263 | 2434.89 |
| 29093.0663 | 2431.27 |
| 29103.3064 | 2426.01 |
| 29113.5464 | 2419.5 |
| 29123.7865 | 2412.29 |
| 29134.0266 | 2404.91 |
| 29144.2666 | 2397.92 |
| 29154.5067 | 2391.86 |
| 29164.7467 | 2387.12 |
| 29174.9868 | 2383.49 |
| 29185.2268 | 2380.6 |
| 29195.4669 | 2378.13 |
| 29205.707 | 2376.15 |
| 29215.947 | 2374.78 |
| 29226.1871 | 2374.12 |
| 29236.4271 | 2374.33 |
| 29246.6672 | 2375.5 |
| 29256.9072 | 2377.78 |
| 29267.1473 | 2381.16 |
| 29277.3874 | 2385.14 |
| 29287.6274 | 2389.1 |
| 29297.8675 | 2392.43 |
| 29308.1075 | 2394.49 |
| 29318.3476 | 2394.67 |
| 29328.5877 | 2392.55 |
| 29338.8277 | 2388.52 |
| 29349.0678 | 2383.17 |
| 29359.3078 | 2377.09 |
| 29369.5479 | 2370.88 |
| 29379.7879 | 2365.11 |
| 29390.028 | 2360.27 |
| 29400.2681 | 2356.38 |
| 29410.5081 | 2353.31 |
| 29420.7482 | 2350.98 |
| 29430.9882 | 2349.26 |
| 29441.2283 | 2348.07 |
| 29451.4683 | 2347.29 |
| 29461.7084 | 2346.81 |
| 29471.9485 | 2346.57 |
| 29482.1885 | 2346.58 |
| 29492.4286 | 2346.91 |
| 29502.6686 | 2347.6 |
| 29512.9087 | 2348.72 |
| 29523.1487 | 2350.31 |
| 29533.3888 | 2352.44 |
| 29543.6289 | 2355.15 |
| 29553.8689 | 2358.45 |
| 29564.109 | 2362.31 |
| 29574.349 | 2366.75 |
| 29584.5891 | 2371.75 |
| 29594.8292 | 2377.31 |
| 29605.0692 | 2383.41 |
| 29615.3093 | 2389.92 |
| 29625.5493 | 2396.16 |
| 29635.7894 | 2401.3 |
| 29646.0294 | 2404.53 |
| 29656.2695 | 2405.28 |
| 29666.5096 | 2404.02 |
| 29676.7496 | 2401.47 |
| 29686.9897 | 2398.34 |
| 29697.2297 | 2395.37 |
| 29707.4698 | 2393.26 |
| 29717.7098 | 2392.56 |
| 29727.9499 | 2393.04 |
| 29738.19 | 2394.29 |
| 29748.43 | 2395.91 |
| 29758.6701 | 2397.49 |
| 29768.9101 | 2398.77 |
| 29779.1502 | 2400.07 |
| 29789.3903 | 2401.85 |
| 29799.6303 | 2404.59 |
| 29809.8704 | 2408.75 |
| 29820.1104 | 2414.63 |
| 29830.3505 | 2421.88 |
| 29840.5905 | 2429.99 |
| 29850.8306 | 2438.46 |
| 29861.0707 | 2446.75 |
| 29871.3107 | 2454.46 |
| 29881.5508 | 2461.51 |
| 29891.7908 | 2467.91 |
| 29902.0309 | 2473.67 |
| 29912.2709 | 2478.81 |
| 29922.511 | 2483.35 |
| 29932.7511 | 2487.3 |
| 29942.9911 | 2490.66 |
| 29953.2312 | 2493.46 |
| 29963.4712 | 2495.71 |
| 29973.7113 | 2497.43 |
| 29983.9513 | 2501.65 |
| 29994.1914 | 2501.65 |
| 30004.4315 | 2511.5 |
| 30014.6715 | 2512.91 |
| 30024.9116 | 2514.32 |
| 30035.1516 | 2518.54 |
| 30045.3917 | 2524.17 |
| 30055.6318 | 2526.99 |
| 30065.8718 | 2528.4 |
| 30076.1119 | 2532.62 |
| 30086.3519 | 2535.43 |
| 30096.592 | 2538.25 |
| 30106.832 | 2545.29 |
| 30117.0721 | 2546.69 |
| 30127.3122 | 2549.51 |
| 30137.5522 | 2557.96 |
| 30147.7923 | 2553.73 |
| 30158.0323 | 2553.73 |
| 30168.2724 | 2555.14 |
| 30178.5124 | 2556.55 |
| 30188.7525 | 2541.06 |
| 30198.9926 | 2541.06 |
| 30209.2326 | 2536.84 |
| 30219.4727 | 2535.43 |
| 30229.7127 | 2539.66 |
| 30239.9528 | 2538.25 |
| 30250.1929 | 2541.06 |
| 30260.4329 | 2549.51 |
| 30270.673 | 2549.51 |
| 30280.913 | 2546.69 |
| 30291.1531 | 2545.29 |
| 30301.3931 | 2541.06 |
| 30311.6332 | 2545.29 |
| 30321.8733 | 2549.51 |
| 30332.1133 | 2552.32 |
| 30342.3534 | 2566.4 |
| 30352.5934 | 2567.81 |
| 30362.8335 | 2566.4 |
| 30373.0735 | 2570.62 |
| 30383.3136 | 2572.03 |
| 30393.5537 | 2576.25 |
| 30403.7937 | 2577.66 |
| 30414.0338 | 2581.88 |
| 30424.2738 | 2580.48 |
| 30434.5139 | 2581.88 |
| 30444.754 | 2610.04 |
| 30454.994 | 2614.26 |
| 30465.2341 | 2615.67 |
| 30475.4741 | 2619.89 |
| 30485.7142 | 2636.78 |
| 30495.9542 | 2638.19 |
| 30506.1943 | 2633.97 |
| 30516.4344 | 2632.56 |
| 30526.6744 | 2632.56 |
| 30536.9145 | 2632.56 |
| 30547.1545 | 2628.34 |
| 30557.3946 | 2624.11 |
| 30567.6346 | 2614.26 |
| 30577.8747 | 2614.26 |
| 30588.1148 | 2612.85 |
| 30598.3548 | 2608.63 |
| 30608.5949 | 2607.22 |
| 30618.8349 | 2605.81 |
| 30629.075 | 2607.22 |
| 30639.3151 | 2605.81 |
| 30649.5551 | 2607.22 |
| 30659.7952 | 2615.67 |
| 30670.0352 | 2615.67 |
| 30680.2753 | 2615.67 |
| 30690.5153 | 2619.89 |
| 30700.7554 | 2619.89 |
| 30710.9955 | 2621.3 |
| 30721.2355 | 2621.3 |
| 30731.4756 | 2625.52 |
| 30741.7156 | 2629.74 |
| 30751.9557 | 2633.97 |
| 30762.1957 | 2638.19 |
| 30772.4358 | 2642.41 |
| 30782.6759 | 2646.63 |
| 30792.9159 | 2649.45 |
| 30803.156 | 2624.11 |
| 30813.396 | 2624.11 |
| 30823.6361 | 2628.34 |
| 30833.8762 | 2626.93 |
| 30844.1162 | 2622.71 |
| 30854.3563 | 2601.59 |
| 30864.5963 | 2597.37 |
| 30874.8364 | 2593.15 |
| 30885.0764 | 2593.15 |
| 30895.3165 | 2580.48 |
| 30905.5566 | 2576.25 |
| 30915.7966 | 2574.85 |
| 30926.0367 | 2573.44 |
| 30936.2767 | 2577.66 |
| 30946.5168 | 2579.07 |
| 30956.7568 | 2564.99 |
| 30966.9969 | 2569.22 |
| 30977.237 | 2572.03 |
| 30987.477 | 2570.62 |
| 30997.7171 | 2566.4 |
| 31007.9571 | 2519.95 |
| 31018.1972 | 2521.36 |
| 31028.4373 | 2521.36 |
| 31038.6773 | 2521.36 |
| 31048.9174 | 2517.13 |
| 31059.1574 | 2515.73 |
| 31069.3975 | 2505.87 |
| 31079.6375 | 2507.28 |
| 31089.8776 | 2507.28 |
| 31100.1177 | 2504.47 |
| 31110.3577 | 2503.06 |
| 31120.5978 | 2477.72 |
| 31130.8378 | 2473.5 |
| 31141.0779 | 2477.72 |
| 31151.3179 | 2473.5 |
| 31161.558 | 2469.28 |
| 31171.7981 | 2473.5 |
| 31182.0381 | 2458.01 |
| 31192.2782 | 2453.79 |
| 31202.5182 | 2452.38 |
| 31212.7583 | 2448.16 |
| 31222.9984 | 2443.94 |
| 31233.2384 | 2441.12 |
| 31243.4785 | 2439.72 |
| 31253.7185 | 2436.9 |
| 31263.9586 | 2438.31 |
| 31274.1986 | 2435.49 |
| 31284.4387 | 2435.49 |
| 31294.6788 | 2436.9 |
| 31304.9188 | 2436.9 |
| 31315.1589 | 2436.9 |
| 31325.3989 | 2441.12 |
| 31335.639 | 2442.53 |
| 31345.879 | 2439.72 |
| 31356.1191 | 2441.12 |
| 31366.3592 | 2460.83 |
| 31376.5992 | 2458.01 |
| 31386.8393 | 2458.01 |
| 31397.0793 | 2453.79 |
| 31407.3194 | 2452.38 |
| 31417.5595 | 2452.38 |
| 31427.7995 | 2450.98 |
| 31438.0396 | 2450.98 |
| 31448.2796 | 2452.38 |
| 31458.5197 | 2452.38 |
| 31468.7597 | 2453.79 |
| 31478.9998 | 2462.24 |
| 31489.2399 | 2459.42 |
| 31499.4799 | 2460.83 |
| 31509.72 | 2465.05 |
| 31519.96 | 2469.28 |
| 31530.2001 | 2472.09 |
| 31540.4402 | 2486.17 |
| 31550.6802 | 2487.57 |
| 31560.9203 | 2490.39 |
| 31571.1603 | 2493.2 |
| 31581.4004 | 2493.2 |
| 31591.6404 | 2519.95 |
| 31601.8805 | 2518.54 |
| 31612.1206 | 2515.73 |
| 31622.3606 | 2517.13 |
| 31632.6007 | 2519.95 |
| 31642.8407 | 2534.03 |
| 31653.0808 | 2529.8 |
| 31663.3208 | 2529.8 |
| 31673.5609 | 2529.8 |
| 31683.801 | 2529.8 |
| 31694.041 | 2531.21 |
| 31704.2811 | 2535.43 |
| 31714.5211 | 2535.43 |
| 31724.7612 | 2536.84 |
| 31735.0013 | 2538.25 |
| 31745.2413 | 2549.51 |
| 31755.4814 | 2541.06 |
| 31765.7214 | 2552.32 |
| 31775.9615 | 2556.55 |
| 31786.2015 | 2559.36 |
| 31796.4416 | 2573.44 |
| 31806.6817 | 2574.85 |
| 31816.9217 | 2580.48 |
| 31827.1618 | 2581.88 |
| 31837.4018 | 2584.7 |
| 31847.6419 | 2605.81 |
| 31857.8819 | 2607.22 |
| 31868.122 | 2604.41 |
| 31878.3621 | 2604.41 |
| 31888.6021 | 2608.63 |
| 31898.8422 | 2612.85 |
| 31909.0822 | 2633.97 |
| 31919.3223 | 2636.78 |
| 31929.5624 | 2641 |
| 31939.8024 | 2645.23 |
| 31950.0425 | 2664.93 |
| 31960.2825 | 2660.71 |
| 31970.5226 | 2664.93 |
| 31980.7626 | 2649.45 |
| 31991.0027 | 2645.23 |
| 32001.2428 | 2642.41 |
| 32011.4828 | 2638.19 |
| 32021.7229 | 2622.71 |
| 32031.9629 | 2618.48 |
| 32042.203 | 2614.26 |
| 32052.4431 | 2611.44 |
| 32062.6831 | 2608.63 |
| 32072.9232 | 2604.41 |
| 32083.1632 | 2598.78 |
| 32093.4033 | 2594.55 |
| 32103.6433 | 2594.55 |
| 32113.8834 | 2590.33 |
| 32124.1235 | 2588.92 |
| 32134.3635 | 2588.92 |
| 32144.6036 | 2586.11 |
| 32154.8436 | 2581.88 |
| 32165.0837 | 2581.88 |
| 32175.3237 | 2583.29 |
| 32185.5638 | 2581.88 |
| 32195.8039 | 2584.7 |
| 32206.0439 | 2581.88 |
| 32216.284 | 2581.88 |
| 32226.524 | 2577.66 |
| 32236.7641 | 2577.66 |
| 32247.0042 | 2577.66 |
| 32257.2442 | 2579.07 |
| 32267.4843 | 2580.48 |
| 32277.7243 | 2580.48 |
| 32287.9644 | 2594.55 |
| 32298.2044 | 2594.55 |
| 32308.4445 | 2593.15 |
| 32318.6846 | 2595.96 |
| 32328.9246 | 2591.74 |
| 32339.1647 | 2594.55 |
| 32349.4047 | 2598.78 |
| 32359.6448 | 2598.78 |
| 32369.8848 | 2601.59 |
| 32380.1249 | 2625.52 |
| 32390.365 | 2626.93 |
| 32400.605 | 2626.93 |
| 32410.8451 | 2625.52 |
| 32421.0851 | 2624.11 |
| 32431.3252 | 2625.52 |
| 32441.5653 | 2625.52 |
| 32451.8053 | 2626.93 |
| 32462.0454 | 2622.71 |
| 32472.2854 | 2646.63 |
| 32482.5255 | 2649.45 |
| 32492.7655 | 2649.45 |
| 32503.0056 | 2650.86 |
| 32513.2457 | 2649.45 |
| 32523.4857 | 2650.86 |
| 32533.7258 | 2655.08 |
| 32543.9658 | 2656.49 |
| 32554.2059 | 2660.71 |
| 32564.446 | 2664.93 |
| 32574.686 | 2662.12 |
| 32584.9261 | 2660.71 |
| 32593.1883 | 2660.71 |